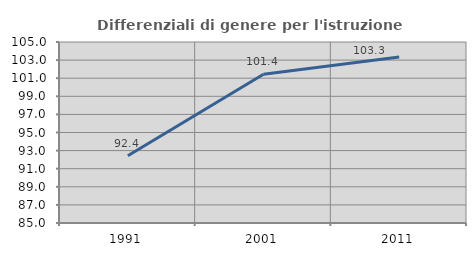
| Category | Differenziali di genere per l'istruzione superiore |
|---|---|
| 1991.0 | 92.427 |
| 2001.0 | 101.442 |
| 2011.0 | 103.333 |